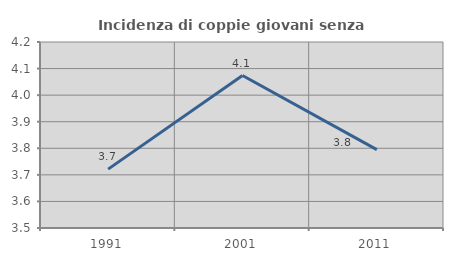
| Category | Incidenza di coppie giovani senza figli |
|---|---|
| 1991.0 | 3.722 |
| 2001.0 | 4.074 |
| 2011.0 | 3.795 |